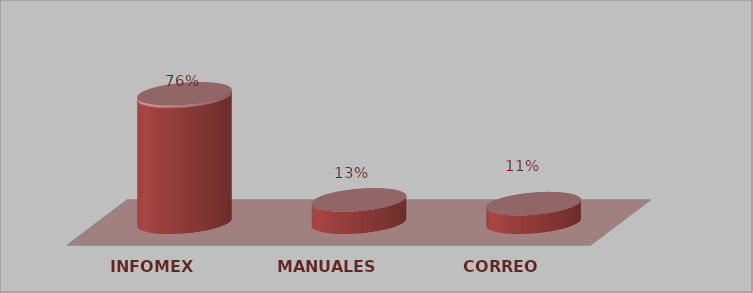
| Category | Series 0 | Series 1 |
|---|---|---|
| INFOMEX | 34 | 0.756 |
| MANUALES | 6 | 0.133 |
| CORREO | 5 | 0.111 |